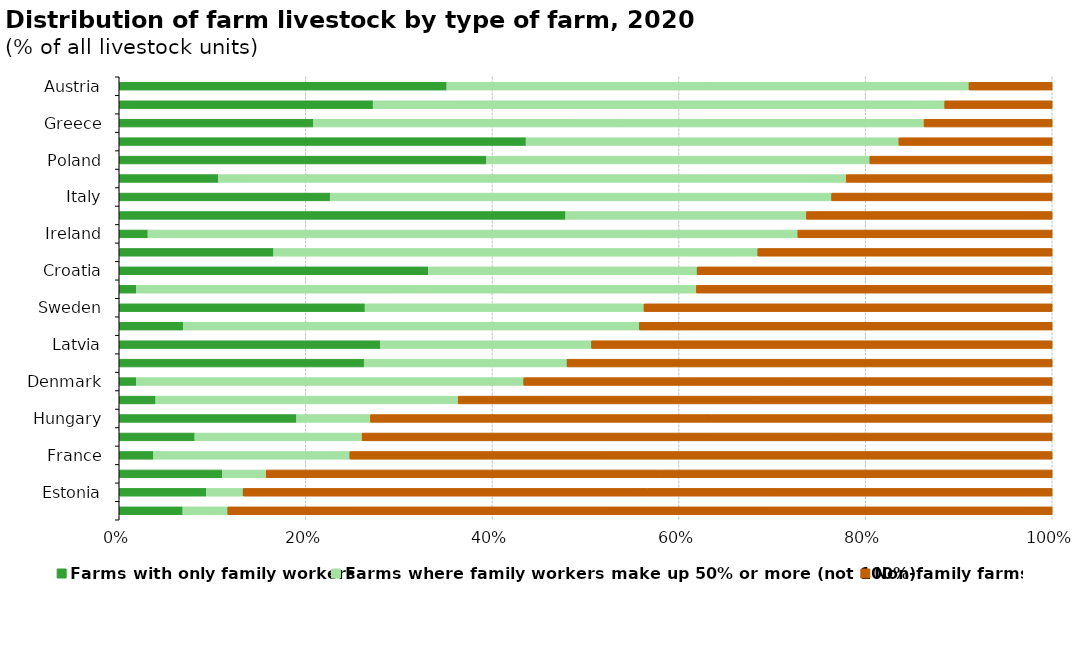
| Category | Farms with only family workers | Farms where family workers make up 50% or more (not 100%) | Non-family farms |
|---|---|---|---|
| Austria | 35.107 | 55.974 | 8.919 |
| Luxembourg | 27.216 | 61.267 | 11.517 |
| Greece | 20.813 | 65.454 | 13.733 |
| Malta | 43.607 | 39.961 | 16.432 |
| Poland | 39.359 | 41.103 | 19.538 |
| Netherlands | 10.62 | 67.301 | 22.079 |
| Italy | 22.613 | 53.746 | 23.641 |
| Romania | 47.847 | 25.815 | 26.338 |
| Ireland | 3.081 | 69.66 | 27.259 |
| Belgium | 16.54 | 51.91 | 31.55 |
| Croatia | 33.128 | 28.81 | 38.062 |
| Finland | 1.832 | 60.037 | 38.132 |
| Sweden | 26.349 | 29.901 | 43.75 |
| Germany | 6.858 | 48.897 | 44.246 |
| Latvia | 27.999 | 22.621 | 49.38 |
| Bulgaria | 26.257 | 21.745 | 51.998 |
| Denmark | 1.836 | 41.524 | 56.639 |
| Portugal | 3.904 | 32.44 | 63.656 |
| Hungary | 19.001 | 7.936 | 73.063 |
| Cyprus | 8.103 | 17.937 | 73.96 |
| France | 3.677 | 21.044 | 75.279 |
| Czechia | 11.052 | 4.703 | 84.245 |
| Estonia | 9.34 | 3.937 | 86.723 |
| Slovakia | 6.821 | 4.815 | 88.364 |